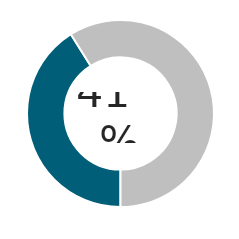
| Category | Series 0 |
|---|---|
| 0 | 0.411 |
| 1 | 0.589 |